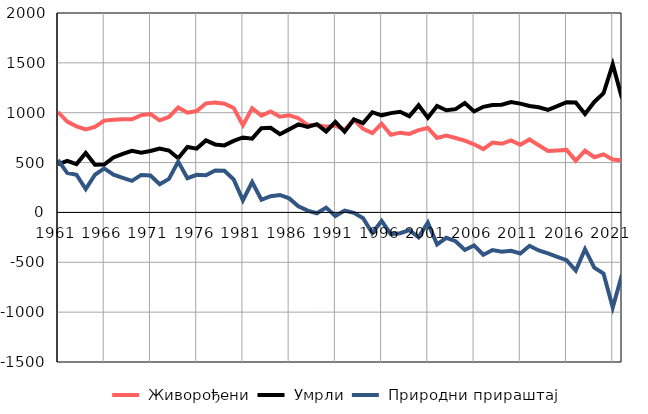
| Category |  Живорођени |  Умрли |  Природни прираштај |
|---|---|---|---|
| 1961.0 | 1007 | 481 | 526 |
| 1962.0 | 911 | 516 | 395 |
| 1963.0 | 863 | 485 | 378 |
| 1964.0 | 832 | 597 | 235 |
| 1965.0 | 857 | 479 | 378 |
| 1966.0 | 921 | 480 | 441 |
| 1967.0 | 930 | 552 | 378 |
| 1968.0 | 935 | 588 | 347 |
| 1969.0 | 934 | 617 | 317 |
| 1970.0 | 976 | 600 | 376 |
| 1971.0 | 986 | 616 | 370 |
| 1972.0 | 923 | 641 | 282 |
| 1973.0 | 957 | 621 | 336 |
| 1974.0 | 1053 | 543 | 510 |
| 1975.0 | 1000 | 657 | 343 |
| 1976.0 | 1017 | 640 | 377 |
| 1977.0 | 1094 | 722 | 372 |
| 1978.0 | 1103 | 682 | 421 |
| 1979.0 | 1090 | 672 | 418 |
| 1980.0 | 1048 | 717 | 331 |
| 1981.0 | 874 | 752 | 122 |
| 1982.0 | 1045 | 740 | 305 |
| 1983.0 | 971 | 844 | 127 |
| 1984.0 | 1012 | 849 | 163 |
| 1985.0 | 960 | 785 | 175 |
| 1986.0 | 974 | 833 | 141 |
| 1987.0 | 945 | 883 | 62 |
| 1988.0 | 875 | 857 | 18 |
| 1989.0 | 877 | 885 | -8 |
| 1990.0 | 860 | 812 | 48 |
| 1991.0 | 871 | 907 | -36 |
| 1992.0 | 828 | 809 | 19 |
| 1993.0 | 928 | 932 | -4 |
| 1994.0 | 838 | 896 | -58 |
| 1995.0 | 796 | 1005 | -209 |
| 1996.0 | 889 | 974 | -85 |
| 1997.0 | 779 | 996 | -217 |
| 1998.0 | 800 | 1009 | -209 |
| 1999.0 | 787 | 965 | -178 |
| 2000.0 | 825 | 1074 | -249 |
| 2001.0 | 847 | 949 | -102 |
| 2002.0 | 747 | 1068 | -321 |
| 2003.0 | 771 | 1025 | -254 |
| 2004.0 | 747 | 1036 | -289 |
| 2005.0 | 721 | 1097 | -376 |
| 2006.0 | 683 | 1013 | -330 |
| 2007.0 | 635 | 1059 | -424 |
| 2008.0 | 700 | 1077 | -377 |
| 2009.0 | 688 | 1081 | -393 |
| 2010.0 | 723 | 1107 | -384 |
| 2011.0 | 679 | 1091 | -412 |
| 2012.0 | 732 | 1067 | -335 |
| 2013.0 | 673 | 1054 | -381 |
| 2014.0 | 617 | 1028 | -411 |
| 2015.0 | 621 | 1066 | -445 |
| 2016.0 | 627 | 1105 | -478 |
| 2017.0 | 519 | 1103 | -584 |
| 2018.0 | 619 | 988 | -369 |
| 2019.0 | 554 | 1108 | -554 |
| 2020.0 | 583 | 1195 | -612 |
| 2021.0 | 531 | 1485 | -954 |
| 2022.0 | 523 | 1146 | -623 |